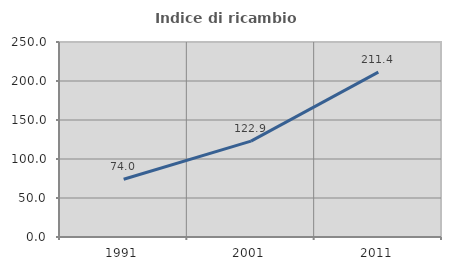
| Category | Indice di ricambio occupazionale  |
|---|---|
| 1991.0 | 74.038 |
| 2001.0 | 122.888 |
| 2011.0 | 211.439 |